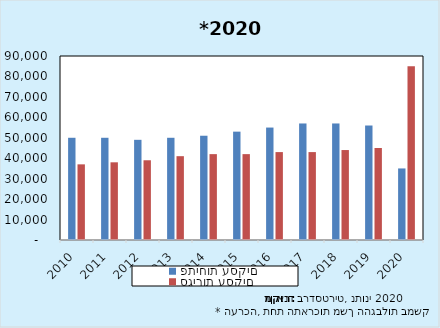
| Category | פתיחות עסקים | סגירות עסקים |
|---|---|---|
| 2010.0 | 50000 | 37000 |
| 2011.0 | 50000 | 38000 |
| 2012.0 | 49000 | 39000 |
| 2013.0 | 50000 | 41000 |
| 2014.0 | 51000 | 42000 |
| 2015.0 | 53000 | 42000 |
| 2016.0 | 55000 | 43000 |
| 2017.0 | 57000 | 43000 |
| 2018.0 | 57000 | 44000 |
| 2019.0 | 56000 | 45000 |
| 2020.0 | 35000 | 85000 |